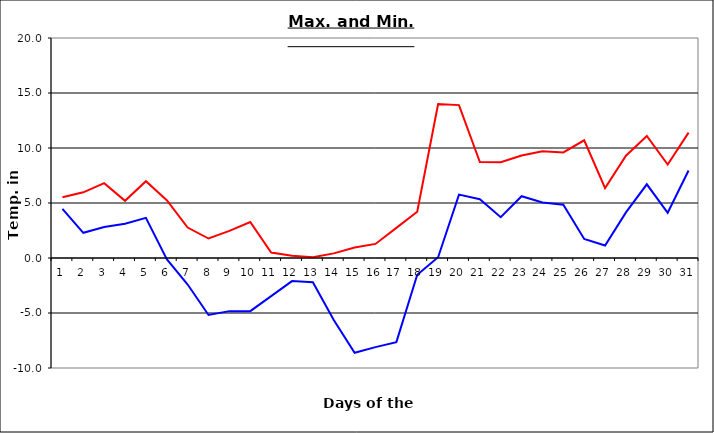
| Category | Series 0 | Series 1 |
|---|---|---|
| 0 | 5.53 | 4.46 |
| 1 | 5.97 | 2.29 |
| 2 | 6.8 | 2.82 |
| 3 | 5.2 | 3.11 |
| 4 | 6.98 | 3.65 |
| 5 | 5.25 | -0.1 |
| 6 | 2.77 | -2.41 |
| 7 | 1.77 | -5.18 |
| 8 | 2.46 | -4.83 |
| 9 | 3.27 | -4.83 |
| 10 | 0.49 | -3.47 |
| 11 | 0.2 | -2.1 |
| 12 | 0.07 | -2.2 |
| 13 | 0.42 | -5.63 |
| 14 | 0.96 | -8.62 |
| 15 | 1.28 | -8.1 |
| 16 | 2.74 | -7.65 |
| 17 | 4.2 | -1.52 |
| 18 | 14 | 0.07 |
| 19 | 13.9 | 5.76 |
| 20 | 8.72 | 5.34 |
| 21 | 8.7 | 3.71 |
| 22 | 9.31 | 5.62 |
| 23 | 9.7 | 5.05 |
| 24 | 9.6 | 4.85 |
| 25 | 10.7 | 1.73 |
| 26 | 6.35 | 1.13 |
| 27 | 9.3 | 4.15 |
| 28 | 11.1 | 6.7 |
| 29 | 8.5 | 4.11 |
| 30 | 11.4 | 7.96 |